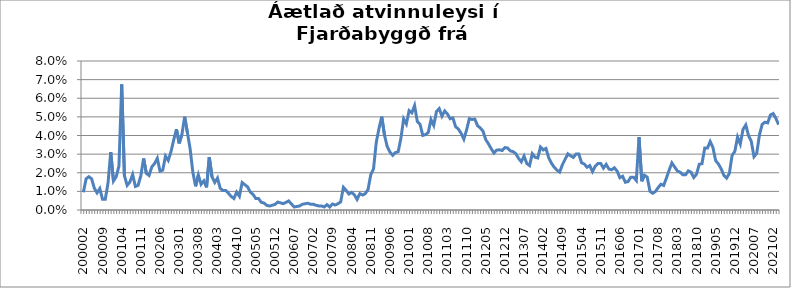
| Category | Series 0 |
|---|---|
| 200002 | 0.009 |
| 200003 | 0.017 |
| 200004 | 0.018 |
| 200005 | 0.017 |
| 200006 | 0.012 |
| 200007 | 0.009 |
| 200008 | 0.012 |
| 200009 | 0.006 |
| 200010 | 0.006 |
| 200011 | 0.014 |
| 200012 | 0.031 |
| 200101 | 0.016 |
| 200102 | 0.018 |
| 200103 | 0.024 |
| 200104 | 0.067 |
| 200105 | 0.018 |
| 200106 | 0.013 |
| 200107 | 0.015 |
| 200108 | 0.019 |
| 200109 | 0.013 |
| 200110 | 0.013 |
| 200111 | 0.018 |
| 200112 | 0.028 |
| 200201 | 0.02 |
| 200202 | 0.019 |
| 200203 | 0.023 |
| 200204 | 0.025 |
| 200205 | 0.028 |
| 200206 | 0.021 |
| 200207 | 0.021 |
| 200208 | 0.029 |
| 200209 | 0.027 |
| 200210 | 0.031 |
| 200211 | 0.038 |
| 200212 | 0.043 |
| 200301 | 0.036 |
| 200302 | 0.041 |
| 200303 | 0.05 |
| 200304 | 0.042 |
| 200305 | 0.033 |
| 200306 | 0.02 |
| 200307 | 0.013 |
| 200308 | 0.019 |
| 200309 | 0.014 |
| 200310 | 0.016 |
| 200311 | 0.012 |
| 200312 | 0.028 |
| 200401 | 0.018 |
| 200402 | 0.015 |
| 200403 | 0.017 |
| 200404 | 0.012 |
| 200405 | 0.01 |
| 200406 | 0.01 |
| 200407 | 0.009 |
| 200408 | 0.007 |
| 200409 | 0.006 |
| 200410 | 0.01 |
| 200411 | 0.007 |
| 200412 | 0.015 |
| 200501 | 0.014 |
| 200502 | 0.012 |
| 200503 | 0.01 |
| 200504 | 0.008 |
| 200505 | 0.006 |
| 200506 | 0.006 |
| 200507 | 0.004 |
| 200508 | 0.004 |
| 200509 | 0.002 |
| 200510 | 0.002 |
| 200511 | 0.003 |
| 200512 | 0.003 |
| 200601 | 0.004 |
| 200602 | 0.004 |
| 200603 | 0.003 |
| 200604 | 0.004 |
| 200605 | 0.005 |
| 200606 | 0.003 |
| 200607 | 0.002 |
| 200608 | 0.002 |
| 200609 | 0.002 |
| 200610 | 0.003 |
| 200611 | 0.003 |
| 200612 | 0.004 |
| 200701 | 0.003 |
| 200702 | 0.003 |
| 200703 | 0.003 |
| 200704 | 0.002 |
| 200705 | 0.002 |
| 200706 | 0.002 |
| 200707 | 0.003 |
| 200708 | 0.002 |
| 200709 | 0.003 |
| 200710 | 0.003 |
| 200711 | 0.003 |
| 200712 | 0.004 |
| 200801 | 0.012 |
| 200802 | 0.011 |
| 200803 | 0.009 |
| 200804 | 0.009 |
| 200805 | 0.008 |
| 200806 | 0.006 |
| 200807 | 0.009 |
| 200808 | 0.008 |
| 200809 | 0.009 |
| 200810 | 0.011 |
| 200811 | 0.019 |
| 200812 | 0.022 |
| 200901 | 0.036 |
| 200902 | 0.044 |
| 200903 | 0.05 |
| 200904 | 0.04 |
| 200905 | 0.034 |
| 200906 | 0.031 |
| 200907 | 0.029 |
| 200908 | 0.031 |
| 200909 | 0.031 |
| 200910 | 0.038 |
| 200911 | 0.049 |
| 200912 | 0.046 |
| 201001 | 0.053 |
| 201002 | 0.052 |
| 201003 | 0.056 |
| 201004 | 0.048 |
| 201005 | 0.046 |
| 201006 | 0.04 |
| 201007 | 0.04 |
| 201008 | 0.042 |
| 201009 | 0.049 |
| 201010 | 0.045 |
| 201011 | 0.053 |
| 201012 | 0.054 |
| 201101 | 0.05 |
| 201102 | 0.053 |
| 201103 | 0.052 |
| 201104 | 0.049 |
| 201105 | 0.049 |
| 201106 | 0.045 |
| 201107 | 0.043 |
| 201108 | 0.041 |
| 201109 | 0.038 |
| 201110 | 0.043 |
| 201111 | 0.049 |
| 201112 | 0.049 |
| 201201 | 0.049 |
| 201202 | 0.045 |
| 201203 | 0.044 |
| 201204 | 0.042 |
| 201205 | 0.038 |
| 201206 | 0.036 |
| 201207 | 0.033 |
| 201208 | 0.031 |
| 201209 | 0.032 |
| 201210 | 0.032 |
| 201211 | 0.032 |
| 201212 | 0.034 |
| 201301 | 0.033 |
| 201302 | 0.032 |
| 201303 | 0.031 |
| 201304 | 0.03 |
| 201305 | 0.028 |
| 201306 | 0.026 |
| 201307 | 0.029 |
| 201308 | 0.025 |
| 201309 | 0.024 |
| 201310 | 0.03 |
| 201311 | 0.028 |
| 201312 | 0.028 |
| 201401 | 0.034 |
| 201402 | 0.032 |
| 201403 | 0.033 |
| 201404 | 0.028 |
| 201405 | 0.025 |
| 201406 | 0.023 |
| 201407 | 0.021 |
| 201408 | 0.02 |
| 201409 | 0.024 |
| 201410 | 0.027 |
| 201411 | 0.03 |
| 201412 | 0.029 |
| 201501 | 0.028 |
| 201502 | 0.03 |
| 201503 | 0.03 |
| 201504 | 0.025 |
| 201505 | 0.025 |
| 201506 | 0.023 |
| 201507 | 0.024 |
| 201508 | 0.021 |
| 201509 | 0.023 |
| 201510 | 0.025 |
| 201511 | 0.025 |
| 201512 | 0.022 |
| 201601 | 0.025 |
| 201602 | 0.022 |
| 201603 | 0.022 |
| 201604 | 0.023 |
| 201605 | 0.021 |
| 201606 | 0.017 |
| 201607 | 0.018 |
| 201608 | 0.015 |
| 201609 | 0.015 |
| 201610 | 0.018 |
| 201611 | 0.018 |
| 201612 | 0.016 |
| 201701 | 0.039 |
| 201702 | 0.015 |
| 201703 | 0.019 |
| 201704 | 0.018 |
| 201705 | 0.01 |
| 201706 | 0.009 |
| 201707 | 0.01 |
| 201708 | 0.012 |
| 201709 | 0.014 |
| 201710 | 0.013 |
| 201711 | 0.017 |
| 201712 | 0.021 |
| 201801 | 0.025 |
| 201802 | 0.023 |
| 201803 | 0.021 |
| 201804 | 0.02 |
| 201805 | 0.019 |
| 201806 | 0.019 |
| 201807 | 0.021 |
| 201808 | 0.02 |
| 201809 | 0.017 |
| 201810 | 0.019 |
| 201811 | 0.025 |
| 201812 | 0.025 |
| 201901 | 0.033 |
| 201902 | 0.033 |
| 201903 | 0.037 |
| 201904 | 0.034 |
| 201905 | 0.026 |
| 201906 | 0.025 |
| 201907 | 0.022 |
| 201908 | 0.019 |
| 201909 | 0.017 |
| 201910 | 0.02 |
| 201911 | 0.029 |
| 201912 | 0.031 |
| 202001 | 0.039 |
| 202002 | 0.035 |
| 202003*** | 0.043 |
| 202004 | 0.046 |
| 202005 | 0.04 |
| 202006 | 0.037 |
| 202007 | 0.029 |
| 202008 | 0.03 |
| 202009 | 0.04 |
| 202010 | 0.046 |
| 202011 | 0.047 |
| 202012 | 0.047 |
| 202101 | 0.051 |
| 202102 | 0.052 |
| 202103 | 0.049 |
| 202104 | 0.046 |